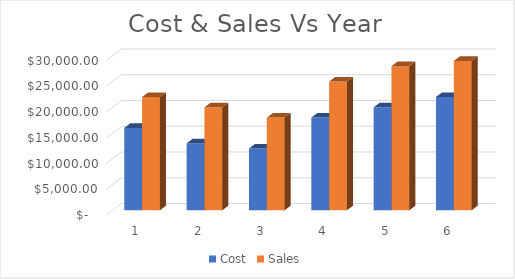
| Category | Cost | Sales |
|---|---|---|
| 0 | 16000 | 22000 |
| 1 | 13000 | 20000 |
| 2 | 12000 | 18000 |
| 3 | 18000 | 25000 |
| 4 | 20000 | 28000 |
| 5 | 22000 | 29000 |